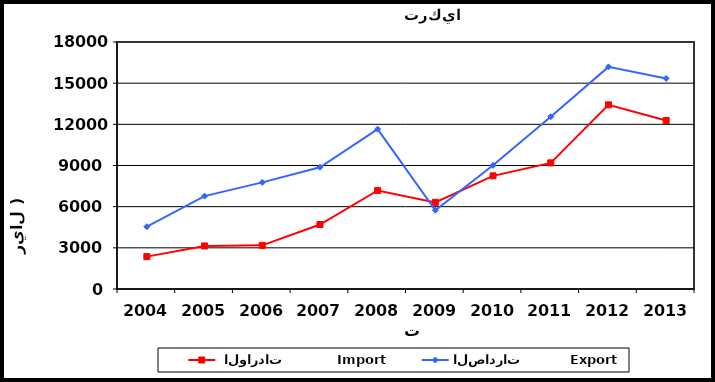
| Category |  الواردات           Import | الصادرات          Export |
|---|---|---|
| 2004.0 | 2360 | 4539 |
| 2005.0 | 3139 | 6769 |
| 2006.0 | 3183 | 7771 |
| 2007.0 | 4699 | 8872 |
| 2008.0 | 7181 | 11650 |
| 2009.0 | 6314 | 5737 |
| 2010.0 | 8246 | 9012 |
| 2011.0 | 9192 | 12555 |
| 2012.0 | 13422 | 16187 |
| 2013.0 | 12283 | 15346 |